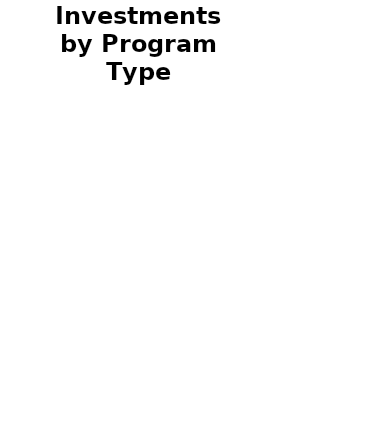
| Category | Series 0 |
|---|---|
| SHELTERS | 0 |
| TH | 0 |
| RRH | 0 |
| PH | 0 |